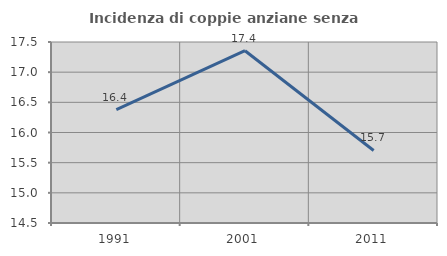
| Category | Incidenza di coppie anziane senza figli  |
|---|---|
| 1991.0 | 16.379 |
| 2001.0 | 17.355 |
| 2011.0 | 15.702 |